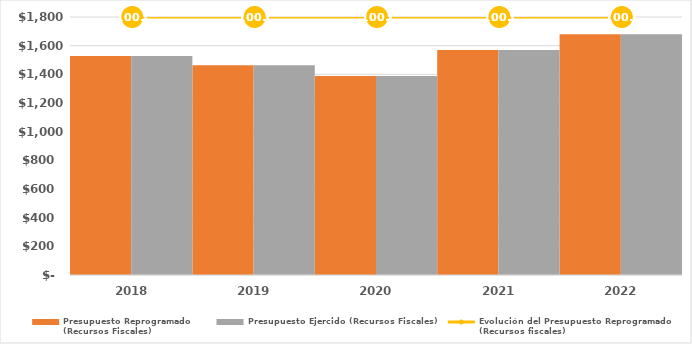
| Category | Presupuesto Reprogramado
(Recursos Fiscales) | Presupuesto Ejercido (Recursos Fiscales) |
|---|---|---|
| 2018.0 | 1528166.306 | 1528166.306 |
| 2019.0 | 1463719.928 | 1463719.928 |
| 2020.0 | 1388683.685 | 1388683.685 |
| 2021.0 | 1569932.387 | 1569932.387 |
| 2022.0 | 1680174.252 | 1680174.252 |